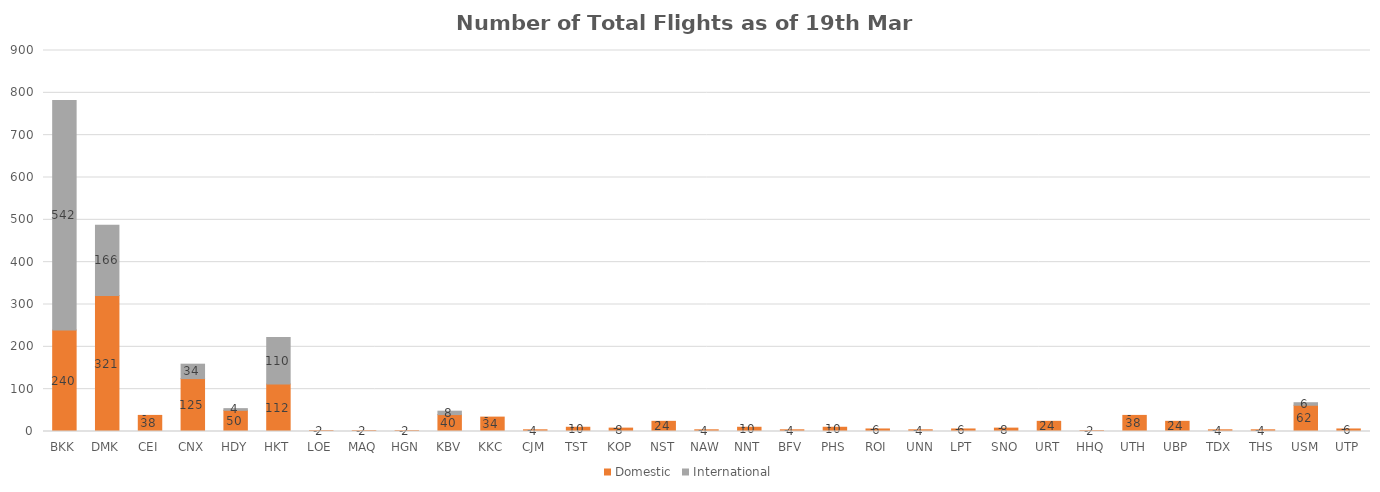
| Category | Domestic | International |
|---|---|---|
| BKK | 240 | 542 |
| DMK | 321 | 166 |
| CEI | 38 | 0 |
| CNX | 125 | 34 |
| HDY | 50 | 4 |
| HKT | 112 | 110 |
| LOE | 2 | 0 |
| MAQ | 2 | 0 |
| HGN | 2 | 0 |
| KBV | 40 | 8 |
| KKC | 34 | 0 |
| CJM | 4 | 0 |
| TST | 10 | 0 |
| KOP | 8 | 0 |
| NST | 24 | 0 |
| NAW | 4 | 0 |
| NNT | 10 | 0 |
| BFV | 4 | 0 |
| PHS | 10 | 0 |
| ROI | 6 | 0 |
| UNN | 4 | 0 |
| LPT | 6 | 0 |
| SNO | 8 | 0 |
| URT | 24 | 0 |
| HHQ | 2 | 0 |
| UTH | 38 | 0 |
| UBP | 24 | 0 |
| TDX | 4 | 0 |
| THS | 4 | 0 |
| USM | 62 | 6 |
| UTP | 6 | 0 |